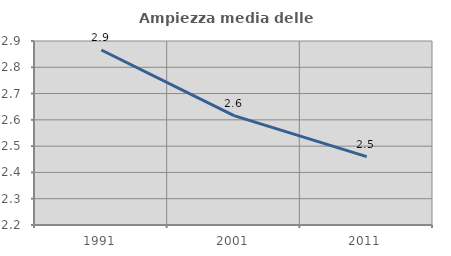
| Category | Ampiezza media delle famiglie |
|---|---|
| 1991.0 | 2.866 |
| 2001.0 | 2.616 |
| 2011.0 | 2.46 |